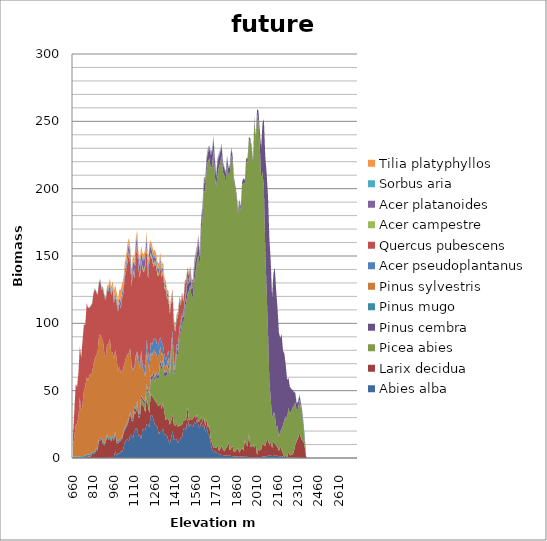
| Category | Abies alba | Larix decidua | Picea abies | Pinus cembra | Pinus mugo | Pinus sylvestris | Acer pseudoplantanus | Quercus pubescens | Acer campestre | Acer platanoides | Sorbus aria | Tilia platyphyllos |
|---|---|---|---|---|---|---|---|---|---|---|---|---|
| 660.0 | 0 | 0 | 0 | 0 | 0.553 | 7.628 | 0 | 8.391 | 0 | 0 | 0 | 0 |
| 670.0 | 0 | 0 | 0 | 0 | 1.092 | 14.611 | 0 | 19.9 | 0 | 0 | 0.004 | 0 |
| 680.0 | 0 | 0 | 0 | 0 | 1.154 | 23.184 | 0 | 30.595 | 0 | 0 | 0.009 | 0 |
| 690.0 | 0 | 0 | 0 | 0.001 | 0.747 | 24.879 | 0 | 27.264 | 0 | 0 | 0.007 | 0 |
| 700.0 | 0 | 0.001 | 0 | 0 | 1.039 | 29.308 | 0 | 33.375 | 0 | 0 | 0.004 | 0 |
| 710.0 | 0.001 | 0.005 | 0 | 0.007 | 1.251 | 43.691 | 0 | 37.955 | 0.001 | 0 | 0.033 | 0 |
| 720.0 | 0.001 | 0.025 | 0 | 0.006 | 1.204 | 32.964 | 0 | 40.258 | 0 | 0 | 0.059 | 0 |
| 730.0 | 0.006 | 0.107 | 0 | 0.009 | 1.093 | 38.507 | 0 | 47.532 | 0 | 0 | 0.059 | 0 |
| 740.0 | 0.01 | 0.091 | 0 | 0.01 | 1.386 | 48.705 | 0 | 48.924 | 0.001 | 0 | 0.09 | 0.001 |
| 750.0 | 0.004 | 0.028 | 0 | 0.018 | 1.806 | 50.579 | 0 | 46.245 | 0 | 0.001 | 0.112 | 0 |
| 760.0 | 0.004 | 1.65 | 0 | 0.017 | 1.257 | 57.588 | 0 | 54.304 | 0.002 | 0 | 0.22 | 0.002 |
| 770.0 | 0.011 | 1.138 | 0 | 0.018 | 1.195 | 54.765 | 0 | 54.594 | 0.002 | 0 | 0.171 | 0.002 |
| 780.0 | 0.014 | 1.143 | 0 | 0.019 | 1.459 | 58.888 | 0 | 49.966 | 0.003 | 0 | 0.278 | 0.004 |
| 790.0 | 0.011 | 1.18 | 0 | 0.018 | 1.632 | 59.679 | 0 | 50.544 | 0.005 | 0.005 | 0.263 | 0.004 |
| 800.0 | 0.013 | 2.947 | 0 | 0.021 | 1.125 | 59.226 | 0 | 51.121 | 0.006 | 0 | 0.42 | 0.002 |
| 810.0 | 0.022 | 2.844 | 0 | 0.026 | 1.407 | 65.503 | 0 | 52.335 | 0.002 | 0.001 | 0.564 | 0.008 |
| 820.0 | 0.032 | 3.51 | 0 | 0.035 | 1.442 | 68.87 | 0 | 51.803 | 0.003 | 0.003 | 0.585 | 0.007 |
| 830.0 | 0.024 | 6.032 | 0 | 0.03 | 1.182 | 68.666 | 0 | 47.328 | 0.007 | 0.002 | 0.803 | 0.005 |
| 840.0 | 0.019 | 5.224 | 0 | 0.042 | 1.485 | 71.338 | 0 | 42.749 | 0.006 | 0.005 | 0.831 | 0.016 |
| 850.0 | 0.03 | 12.788 | 0 | 0.043 | 1.38 | 75.548 | 0 | 39.815 | 0.011 | 0.008 | 0.937 | 0.017 |
| 860.0 | 0.026 | 13.085 | 0 | 0.034 | 1.23 | 77.623 | 0 | 39.498 | 0.011 | 0.006 | 1.156 | 0.671 |
| 870.0 | 0.04 | 14.062 | 0 | 0.068 | 1.401 | 73.53 | 0.001 | 35.79 | 0.032 | 0.039 | 1.417 | 0.192 |
| 880.0 | 0.052 | 10.199 | 0.001 | 0.064 | 1.592 | 74.618 | 0 | 39.084 | 0.04 | 0.025 | 1.571 | 0.092 |
| 890.0 | 0.059 | 9.232 | 0 | 0.073 | 1.314 | 66.758 | 0 | 42.352 | 0.047 | 0.111 | 1.133 | 0.716 |
| 900.0 | 0.068 | 11.732 | 0 | 0.089 | 1.677 | 61.973 | 0 | 41.632 | 0.126 | 0.133 | 1.371 | 1.326 |
| 910.0 | 0.105 | 15.899 | 0 | 0.128 | 1.607 | 66.639 | 0 | 39.588 | 0.145 | 0.212 | 1.724 | 1.79 |
| 920.0 | 0.129 | 13.371 | 0 | 0.16 | 1.372 | 69.675 | 0 | 39.178 | 0.188 | 0.208 | 1.838 | 2.367 |
| 930.0 | 0.149 | 14.137 | 0 | 0.226 | 1.854 | 72.182 | 0 | 40.438 | 0.223 | 0.506 | 1.784 | 1.621 |
| 940.0 | 0.173 | 12.23 | 0 | 0.155 | 1.452 | 64.828 | 0 | 41.96 | 0.326 | 0.3 | 1.789 | 3.808 |
| 950.0 | 0.247 | 14.659 | 0 | 0.222 | 1.371 | 62.032 | 0 | 47.195 | 0.353 | 0.512 | 1.857 | 2.939 |
| 960.0 | 0.949 | 11.809 | 0 | 0.276 | 1.996 | 58.618 | 0 | 41.581 | 0.57 | 1.238 | 2.034 | 5.227 |
| 970.0 | 5.049 | 13.441 | 0.001 | 0.341 | 1.353 | 60.098 | 0 | 40.128 | 0.568 | 1.201 | 1.694 | 4.653 |
| 980.0 | 1.83 | 9.222 | 0 | 0.374 | 1.427 | 61.093 | 0 | 40.936 | 0.612 | 1.921 | 1.348 | 4.274 |
| 990.0 | 3.627 | 7.135 | 0 | 0.487 | 1.364 | 51.356 | 0 | 44.537 | 0.633 | 2.521 | 1.147 | 3.994 |
| 1000.0 | 3.202 | 8.713 | 0 | 0.298 | 1.137 | 54.444 | 0 | 47.541 | 0.607 | 2.506 | 0.971 | 5.551 |
| 1010.0 | 4.93 | 7.964 | 0 | 0.503 | 1.085 | 49.142 | 0.003 | 47.28 | 0.729 | 3.9 | 1.229 | 8.308 |
| 1020.0 | 4.653 | 9.189 | 0 | 0.497 | 1.187 | 48.876 | 0.001 | 54.073 | 0.787 | 3.357 | 1.426 | 5.417 |
| 1030.0 | 7.308 | 10.787 | 0 | 0.405 | 1.097 | 47.78 | 0.002 | 55.537 | 0.771 | 3.345 | 1.163 | 5.265 |
| 1040.0 | 11.598 | 9.082 | 0.005 | 0.62 | 1.368 | 48.486 | 0.072 | 63.527 | 0.929 | 3.366 | 1.146 | 5.055 |
| 1050.0 | 13.318 | 9.394 | 0 | 0.772 | 1.304 | 50.295 | 0.001 | 63.797 | 1.026 | 3.713 | 1.26 | 5.221 |
| 1060.0 | 13.776 | 10.543 | 0.013 | 1.467 | 1.218 | 49.666 | 0.332 | 68.847 | 1.395 | 5.705 | 1.322 | 4.919 |
| 1070.0 | 12.647 | 15.578 | 0.072 | 0.987 | 0.811 | 47.836 | 0.146 | 74.336 | 1.175 | 5.755 | 1.056 | 3.082 |
| 1080.0 | 17.599 | 14.766 | 0.074 | 1.339 | 0.773 | 46.378 | 0.663 | 61.974 | 1.273 | 6.426 | 1.03 | 4.353 |
| 1090.0 | 16.613 | 11.102 | 0.167 | 1.266 | 0.753 | 37.624 | 1.043 | 59.346 | 1.34 | 5.717 | 0.719 | 3.378 |
| 1100.0 | 14.806 | 12.322 | 0.823 | 1.005 | 0.782 | 35.118 | 0.662 | 73.247 | 1.314 | 6.278 | 1.221 | 3.497 |
| 1110.0 | 19.271 | 14.372 | 1.137 | 2.76 | 0.709 | 28.852 | 0.826 | 65.72 | 1.289 | 8.153 | 0.952 | 3.436 |
| 1120.0 | 21.896 | 10.876 | 1.329 | 1.99 | 0.794 | 37.381 | 1.709 | 73.609 | 1.387 | 6.823 | 1.127 | 3.683 |
| 1130.0 | 21.854 | 17.008 | 1.12 | 1.538 | 0.673 | 36.321 | 0.822 | 79.693 | 1.102 | 5.013 | 1.056 | 2.985 |
| 1140.0 | 16.397 | 13.992 | 0.408 | 1.451 | 0.745 | 37.478 | 4.97 | 65.165 | 1.536 | 6.902 | 1.004 | 3.212 |
| 1150.0 | 16.94 | 12.711 | 1.197 | 1.977 | 0.7 | 32.496 | 1.198 | 66.644 | 1.582 | 6.792 | 1.447 | 3.753 |
| 1160.0 | 13.907 | 25.603 | 4.53 | 1.886 | 0.602 | 31.178 | 2.481 | 65.457 | 1.473 | 5.875 | 1.036 | 3.124 |
| 1170.0 | 21.735 | 17.494 | 3.024 | 1.801 | 0.549 | 22.276 | 2.606 | 70.364 | 1.739 | 5.87 | 1.124 | 3.419 |
| 1180.0 | 20.619 | 17.431 | 2.973 | 1.783 | 0.584 | 21.76 | 4.33 | 68.583 | 1.808 | 6.351 | 1.308 | 3.564 |
| 1190.0 | 20.876 | 12.624 | 6.344 | 1.825 | 0.496 | 17.583 | 7.456 | 74.625 | 1.907 | 7.504 | 1.093 | 3.322 |
| 1200.0 | 25.218 | 20.291 | 6.804 | 2.19 | 0.58 | 24.909 | 7.975 | 68.63 | 1.84 | 5.456 | 0.949 | 3.153 |
| 1210.0 | 25.19 | 13.01 | 9.523 | 2.302 | 0.583 | 21.438 | 7.609 | 53.189 | 1.974 | 6.294 | 1.083 | 3.228 |
| 1220.0 | 22.702 | 10.738 | 10.729 | 2.268 | 0.333 | 17.065 | 7.637 | 74.964 | 1.728 | 6.545 | 0.762 | 2.999 |
| 1230.0 | 31.724 | 16.202 | 10.319 | 2.591 | 0.638 | 17.035 | 7.477 | 64.654 | 2.009 | 4.422 | 1.06 | 3.729 |
| 1240.0 | 31.84 | 14.035 | 12.149 | 2.179 | 0.505 | 15.472 | 7.723 | 63.326 | 2.003 | 4.027 | 0.828 | 3.646 |
| 1250.0 | 28.738 | 15.667 | 16.53 | 3.198 | 0.686 | 15.406 | 8.089 | 53.441 | 2.193 | 4.52 | 1.255 | 3.847 |
| 1260.0 | 24.873 | 17.857 | 13.728 | 2.632 | 0.719 | 19.644 | 9.502 | 55.711 | 2.045 | 3.033 | 1.061 | 3.685 |
| 1270.0 | 23.862 | 17.656 | 19.249 | 2.046 | 0.947 | 13.896 | 10.081 | 54.321 | 2.115 | 3.051 | 1.038 | 3.545 |
| 1280.0 | 22.577 | 16.946 | 19.004 | 2.453 | 0.954 | 12.013 | 7.738 | 53.86 | 2.287 | 2.927 | 0.957 | 3.639 |
| 1290.0 | 17.498 | 20.831 | 21.432 | 2.335 | 0.789 | 14.243 | 9.402 | 48.624 | 2.117 | 3.049 | 1.105 | 3.154 |
| 1300.0 | 19.954 | 21.135 | 27.819 | 2.853 | 0.662 | 10.236 | 7.029 | 53.764 | 2.104 | 3.076 | 0.926 | 3.063 |
| 1310.0 | 19.989 | 16.416 | 29.024 | 2.612 | 0.704 | 7.755 | 9.522 | 48.11 | 2.284 | 2.981 | 0.811 | 3.497 |
| 1320.0 | 21.602 | 19.55 | 28.644 | 2.391 | 0.518 | 4.936 | 6.114 | 54.169 | 1.818 | 2.182 | 0.696 | 2.836 |
| 1330.0 | 17.563 | 16.509 | 26.533 | 2.954 | 0.554 | 4.957 | 7.515 | 49.443 | 2.07 | 2.11 | 0.804 | 3.069 |
| 1340.0 | 17.141 | 10.835 | 32.652 | 2.636 | 0.511 | 3.98 | 4.925 | 52.068 | 1.791 | 1.969 | 0.76 | 2.364 |
| 1350.0 | 16.376 | 13.145 | 32.584 | 2.742 | 0.664 | 4.028 | 6.555 | 42.047 | 1.909 | 1.958 | 0.649 | 2.335 |
| 1360.0 | 13 | 16.073 | 38.718 | 3.312 | 0.622 | 3.119 | 5.377 | 37.631 | 1.724 | 1.672 | 0.731 | 2.378 |
| 1370.0 | 10.615 | 14.01 | 34.262 | 3.072 | 0.572 | 2.381 | 3.098 | 38.861 | 1.561 | 1.596 | 0.584 | 2.048 |
| 1380.0 | 15.004 | 12.876 | 46.393 | 2.948 | 0.533 | 3.185 | 2.658 | 31.206 | 1.448 | 1.425 | 0.551 | 1.855 |
| 1390.0 | 20.254 | 11.97 | 53.503 | 3.554 | 0.422 | 1.739 | 3.749 | 26.237 | 1.312 | 1.27 | 0.512 | 1.435 |
| 1400.0 | 13.55 | 11.197 | 36.646 | 2.593 | 0.434 | 2.031 | 2.172 | 30.065 | 1.196 | 1.149 | 0.486 | 1.178 |
| 1410.0 | 14.348 | 9.65 | 41.34 | 2.599 | 0.378 | 1.629 | 3.014 | 20.611 | 1.452 | 1.53 | 0.556 | 1.333 |
| 1420.0 | 13.686 | 11.703 | 51.655 | 3.727 | 0.352 | 0.603 | 2.735 | 18.247 | 1.375 | 1.307 | 0.424 | 1.062 |
| 1430.0 | 11.066 | 12.059 | 53.982 | 2.492 | 0.213 | 0.836 | 3.503 | 21.215 | 1.254 | 1.248 | 0.293 | 0.824 |
| 1440.0 | 13.153 | 11.006 | 64.396 | 4.007 | 0.196 | 0.694 | 2.078 | 21.444 | 1.213 | 1.081 | 0.328 | 0.704 |
| 1450.0 | 15.047 | 9.064 | 69.809 | 4.379 | 0.192 | 0.496 | 2.702 | 11.45 | 1.331 | 1.162 | 0.323 | 0.656 |
| 1460.0 | 15.568 | 9.305 | 76.199 | 2.807 | 0.128 | 1.294 | 2.106 | 13.584 | 0.848 | 0.773 | 0.192 | 0.38 |
| 1470.0 | 21.647 | 6.077 | 72.394 | 4.852 | 0.15 | 0.828 | 1.965 | 7.726 | 0.925 | 0.922 | 0.216 | 0.361 |
| 1480.0 | 22.295 | 5.674 | 82.308 | 3.714 | 0.124 | 0.684 | 2.393 | 11.781 | 1.173 | 1.041 | 0.187 | 0.424 |
| 1490.0 | 21.083 | 7.688 | 86.819 | 6.203 | 0.126 | 0.835 | 1.891 | 6.272 | 1.001 | 0.964 | 0.22 | 0.372 |
| 1500.0 | 30.041 | 7.722 | 83.861 | 8.96 | 0.111 | 0.744 | 2.389 | 5.546 | 1.026 | 0.997 | 0.161 | 0.304 |
| 1510.0 | 23.042 | 4.619 | 96.546 | 5.169 | 0.23 | 0.487 | 2.372 | 2.847 | 0.996 | 0.911 | 0.245 | 0.29 |
| 1520.0 | 25.4 | 3.701 | 99.462 | 5.7 | 0.218 | 1.236 | 1.586 | 3.064 | 0.848 | 0.817 | 0.272 | 0.224 |
| 1530.0 | 23.658 | 4.713 | 90.767 | 6.413 | 0.174 | 0.939 | 2.102 | 1.778 | 1.045 | 0.918 | 0.28 | 0.217 |
| 1540.0 | 23.165 | 5.99 | 91.048 | 6.213 | 0.192 | 0.743 | 1.717 | 1.489 | 0.878 | 0.757 | 0.312 | 0.159 |
| 1550.0 | 26.701 | 4.922 | 100.079 | 9.199 | 0.173 | 0.875 | 1.68 | 2.085 | 0.758 | 0.707 | 0.173 | 0.078 |
| 1560.0 | 25.166 | 4.25 | 109.467 | 8.47 | 0.169 | 0.29 | 1.527 | 1.583 | 0.784 | 0.674 | 0.181 | 0.065 |
| 1570.0 | 29.307 | 3.289 | 113.643 | 6.256 | 0.118 | 0.149 | 1.733 | 1.757 | 0.737 | 0.665 | 0.16 | 0.013 |
| 1580.0 | 23.552 | 3.541 | 124.104 | 9.161 | 0.227 | 0.682 | 1.625 | 1.22 | 0.743 | 0.692 | 0.212 | 0.008 |
| 1590.0 | 22.191 | 5.18 | 114.6 | 6.727 | 0.159 | 0.361 | 1.32 | 1.233 | 0.694 | 0.633 | 0.19 | 0.01 |
| 1600.0 | 27.209 | 3.975 | 137.729 | 6.471 | 0.106 | 0.305 | 1.377 | 1.298 | 0.57 | 0.575 | 0.152 | 0.003 |
| 1610.0 | 23.107 | 3.703 | 150.533 | 6.732 | 0.117 | 0.363 | 1.726 | 0.888 | 0.607 | 0.544 | 0.144 | 0 |
| 1620.0 | 25.145 | 5.362 | 167.245 | 5.972 | 0.106 | 1.201 | 1.442 | 0.842 | 0.635 | 0.554 | 0.167 | 0 |
| 1630.0 | 19.323 | 4.344 | 174.543 | 6.911 | 0.009 | 0.061 | 1.521 | 0.673 | 0.465 | 0.386 | 0.089 | 0 |
| 1640.0 | 23.483 | 5.138 | 185.585 | 7.171 | 0.077 | 0.178 | 1.388 | 0.47 | 0.532 | 0.444 | 0.096 | 0 |
| 1650.0 | 18.246 | 4.234 | 197.789 | 6.71 | 0.074 | 0.111 | 1.536 | 0.812 | 0.553 | 0.482 | 0.097 | 0 |
| 1660.0 | 16.437 | 7.685 | 198.539 | 7.073 | 0.086 | 0.066 | 1.111 | 0.356 | 0.344 | 0.305 | 0.079 | 0 |
| 1670.0 | 10.895 | 3.136 | 200.731 | 10.497 | 0.042 | 0.158 | 1.267 | 0.478 | 0.315 | 0.326 | 0.106 | 0 |
| 1680.0 | 6.652 | 4.353 | 205.712 | 9.809 | 0.129 | 0.109 | 1.18 | 0.29 | 0.324 | 0.329 | 0.075 | 0 |
| 1690.0 | 4.119 | 3.447 | 221.416 | 7.728 | 0.036 | 0.131 | 1.198 | 0.491 | 0.315 | 0.296 | 0.058 | 0 |
| 1700.0 | 5.445 | 2.757 | 201.667 | 11.301 | 0.076 | 0.126 | 1.14 | 0.495 | 0.348 | 0.316 | 0.114 | 0 |
| 1710.0 | 3.88 | 3.672 | 193.837 | 7.02 | 0.037 | 0.291 | 1.245 | 0.392 | 0.336 | 0.319 | 0.094 | 0 |
| 1720.0 | 3.752 | 5.609 | 201.19 | 9.701 | 0.11 | 0.167 | 1.312 | 0.411 | 0.348 | 0.293 | 0.107 | 0 |
| 1730.0 | 3.008 | 2.289 | 210.741 | 7.744 | 0.13 | 0.184 | 1.038 | 0.319 | 0.301 | 0.31 | 0.101 | 0 |
| 1740.0 | 2.498 | 4.315 | 212.607 | 7.571 | 0.076 | 0.14 | 1.154 | 0.403 | 0.263 | 0.25 | 0.099 | 0 |
| 1750.0 | 2.245 | 7.032 | 215.198 | 7.053 | 0.065 | 0.169 | 0.964 | 0.3 | 0.205 | 0.186 | 0.076 | 0 |
| 1760.0 | 2.253 | 4.204 | 205.652 | 5.857 | 0.068 | 0.068 | 0.985 | 0.26 | 0.195 | 0.202 | 0.046 | 0 |
| 1770.0 | 1.728 | 3.186 | 204.852 | 5.202 | 0.099 | 0.065 | 0.696 | 0.18 | 0.169 | 0.127 | 0.059 | 0 |
| 1780.0 | 1.828 | 5.134 | 197.75 | 6.317 | 0.086 | 0.134 | 0.917 | 0.188 | 0.191 | 0.165 | 0.048 | 0 |
| 1790.0 | 1.7 | 6.561 | 209.491 | 5.555 | 0.143 | 0.091 | 0.866 | 0.196 | 0.139 | 0.126 | 0.049 | 0 |
| 1800.0 | 1.607 | 10.064 | 198.489 | 4.73 | 0.048 | 0.101 | 0.723 | 0.209 | 0.12 | 0.086 | 0.07 | 0 |
| 1810.0 | 1.636 | 4.06 | 205.915 | 4.695 | 0.076 | 0.117 | 0.819 | 0.166 | 0.134 | 0.108 | 0.068 | 0 |
| 1820.0 | 1.521 | 5.625 | 217.805 | 4.49 | 0.057 | 0.096 | 0.784 | 0.181 | 0.086 | 0.096 | 0.071 | 0 |
| 1830.0 | 1.373 | 7.637 | 211.76 | 3.695 | 0.037 | 0.083 | 0.831 | 0.117 | 0.032 | 0.071 | 0.046 | 0 |
| 1840.0 | 1.16 | 3.374 | 200.468 | 2.769 | 0.014 | 0.027 | 0.695 | 0.133 | 0.013 | 0.056 | 0.036 | 0 |
| 1850.0 | 0.915 | 3.995 | 194.68 | 2.329 | 0.033 | 0.032 | 0.558 | 0.04 | 0.009 | 0.02 | 0.012 | 0 |
| 1860.0 | 1.19 | 5.109 | 187.507 | 1.748 | 0.069 | 0.101 | 0.534 | 0.078 | 0.009 | 0.012 | 0.04 | 0 |
| 1870.0 | 0.946 | 6.195 | 174.1 | 3.165 | 0.096 | 0.082 | 0.448 | 0.085 | 0.005 | 0.007 | 0.033 | 0 |
| 1880.0 | 1.015 | 2.907 | 186.061 | 1.501 | 0.04 | 0.007 | 0.411 | 0.081 | 0 | 0.002 | 0.03 | 0 |
| 1890.0 | 1.102 | 5.252 | 177.377 | 2.487 | 0.014 | 0.008 | 0.298 | 0.024 | 0 | 0.001 | 0.005 | 0 |
| 1900.0 | 1.051 | 6.569 | 195.402 | 1.686 | 0.026 | 0.018 | 0.326 | 0.095 | 0 | 0 | 0.019 | 0 |
| 1910.0 | 0.927 | 4.503 | 198.936 | 3.128 | 0.055 | 0.027 | 0.264 | 0.088 | 0 | 0 | 0.008 | 0 |
| 1920.0 | 0.81 | 12.54 | 190.458 | 2.382 | 0.088 | 0.025 | 0.236 | 0.025 | 0 | 0 | 0.014 | 0 |
| 1930.0 | 0.972 | 9.27 | 209.662 | 2.559 | 0.041 | 0.029 | 0.184 | 0.075 | 0 | 0 | 0.012 | 0 |
| 1940.0 | 0.816 | 7.535 | 210.891 | 3.328 | 0.074 | 0.016 | 0.174 | 0.023 | 0 | 0 | 0.004 | 0 |
| 1950.0 | 0.756 | 17.193 | 218.696 | 1.412 | 0.052 | 0.021 | 0.122 | 0.028 | 0 | 0 | 0.004 | 0 |
| 1960.0 | 0.594 | 8.145 | 227.169 | 1.566 | 0.001 | 0.001 | 0.081 | 0.009 | 0 | 0 | 0 | 0 |
| 1970.0 | 0.586 | 7.352 | 221.894 | 1.853 | 0 | 0 | 0.085 | 0.002 | 0 | 0 | 0 | 0 |
| 1980.0 | 0.62 | 9.307 | 209.494 | 1.935 | 0.022 | 0.019 | 0.104 | 0.004 | 0 | 0 | 0.002 | 0 |
| 1990.0 | 0.474 | 7.051 | 242.803 | 2.136 | 0.002 | 0 | 0.049 | 0.013 | 0 | 0 | 0 | 0 |
| 2000.0 | 0.571 | 9.347 | 224.926 | 3.486 | 0.061 | 0.038 | 0.032 | 0.016 | 0 | 0 | 0.003 | 0 |
| 2010.0 | 0.579 | 1.64 | 253.174 | 3.681 | 0 | 0 | 0.014 | 0.005 | 0 | 0 | 0.001 | 0 |
| 2020.0 | 0.58 | 6.142 | 243.551 | 7.624 | 0.01 | 0.022 | 0.014 | 0.003 | 0 | 0 | 0 | 0 |
| 2030.0 | 0.573 | 4.956 | 225.647 | 11.047 | 0 | 0 | 0 | 0.013 | 0 | 0 | 0 | 0 |
| 2040.0 | 0.732 | 5.866 | 201.117 | 22.963 | 0 | 0 | 0 | 0.004 | 0 | 0 | 0 | 0 |
| 2050.0 | 0.975 | 9.803 | 201.878 | 36.201 | 0 | 0.01 | 0 | 0.002 | 0 | 0 | 0 | 0 |
| 2060.0 | 1.144 | 8.533 | 190.276 | 51.401 | 0.004 | 0 | 0 | 0 | 0 | 0 | 0 | 0 |
| 2070.0 | 1.143 | 7.876 | 146.467 | 68.776 | 0 | 0 | 0 | 0.004 | 0 | 0 | 0 | 0 |
| 2080.0 | 1.269 | 11.853 | 110.503 | 87.897 | 0 | 0 | 0 | 0 | 0 | 0 | 0 | 0 |
| 2090.0 | 1.81 | 11.725 | 80.728 | 100.22 | 0.039 | 0.002 | 0 | 0.002 | 0 | 0 | 0 | 0 |
| 2100.0 | 1.645 | 7.743 | 47.9 | 106.211 | 0.037 | 0.004 | 0 | 0.003 | 0 | 0 | 0 | 0 |
| 2110.0 | 1.738 | 10.256 | 31.925 | 102.049 | 0.206 | 0.104 | 0 | 0.003 | 0 | 0 | 0 | 0 |
| 2120.0 | 1.463 | 5.903 | 22.078 | 89.792 | 0.187 | 0.098 | 0 | 0 | 0 | 0 | 0 | 0 |
| 2130.0 | 1.655 | 10.889 | 21.532 | 103.035 | 0.086 | 0.065 | 0 | 0 | 0 | 0 | 0 | 0 |
| 2140.0 | 1.747 | 8.909 | 21.907 | 108.791 | 0.127 | 0.033 | 0 | 0 | 0 | 0 | 0 | 0 |
| 2150.0 | 1.672 | 7.62 | 13.474 | 101.426 | 0.112 | 0.032 | 0 | 0 | 0 | 0 | 0 | 0 |
| 2160.0 | 1.604 | 6.386 | 16.245 | 86.724 | 0.027 | 0 | 0 | 0 | 0 | 0 | 0 | 0 |
| 2170.0 | 1.339 | 3.748 | 10.424 | 77.629 | 0 | 0 | 0 | 0 | 0 | 0 | 0 | 0 |
| 2180.0 | 1.205 | 7.665 | 10.833 | 69.404 | 0.115 | 0 | 0 | 0 | 0 | 0 | 0 | 0 |
| 2190.0 | 1.296 | 4.68 | 16.064 | 69.921 | 0.034 | 0 | 0 | 0 | 0 | 0 | 0 | 0 |
| 2200.0 | 1.058 | 2.178 | 21.03 | 55.371 | 0.071 | 0 | 0 | 0 | 0 | 0 | 0 | 0 |
| 2210.0 | 0.672 | 0 | 27.574 | 49.235 | 0 | 0 | 0 | 0 | 0 | 0 | 0 | 0 |
| 2220.0 | 0.741 | 1.22 | 29.053 | 38.401 | 0 | 0 | 0 | 0 | 0 | 0 | 0 | 0 |
| 2230.0 | 0.565 | 0 | 28.438 | 28.995 | 0 | 0 | 0 | 0 | 0 | 0 | 0 | 0 |
| 2240.0 | 0.578 | 3.855 | 32.943 | 22.2 | 0 | 0 | 0 | 0 | 0 | 0 | 0 | 0 |
| 2250.0 | 0.484 | 1.466 | 30.798 | 20.227 | 0 | 0 | 0 | 0 | 0 | 0 | 0 | 0 |
| 2260.0 | 0.391 | 1.946 | 32.694 | 16.422 | 0 | 0 | 0 | 0 | 0 | 0 | 0 | 0 |
| 2270.0 | 0.299 | 2.001 | 34.828 | 13.43 | 0.025 | 0 | 0 | 0 | 0 | 0 | 0 | 0 |
| 2280.0 | 0.251 | 4.733 | 34.073 | 9.795 | 0.406 | 0 | 0 | 0 | 0 | 0 | 0 | 0 |
| 2290.0 | 0.157 | 9.492 | 31.554 | 6.737 | 0.889 | 0 | 0 | 0 | 0 | 0 | 0 | 0 |
| 2300.0 | 0.152 | 12.475 | 22.968 | 4.997 | 0.521 | 0 | 0 | 0 | 0 | 0 | 0 | 0 |
| 2310.0 | 0.13 | 14.367 | 21.624 | 5.004 | 0.579 | 0 | 0 | 0 | 0 | 0 | 0 | 0 |
| 2320.0 | 0.205 | 18.662 | 24.225 | 3.382 | 0.93 | 0 | 0 | 0 | 0 | 0 | 0 | 0 |
| 2330.0 | 0.047 | 15.67 | 22.553 | 3.024 | 0.555 | 0 | 0 | 0 | 0 | 0 | 0 | 0 |
| 2340.0 | 0.002 | 13.027 | 18.392 | 3.189 | 1.04 | 0 | 0 | 0 | 0 | 0 | 0 | 0 |
| 2350.0 | 0 | 12.552 | 9.076 | 3.056 | 2.172 | 0 | 0 | 0 | 0 | 0 | 0 | 0 |
| 2360.0 | 0 | 8.019 | 2.988 | 2.39 | 2.048 | 0 | 0 | 0 | 0 | 0 | 0 | 0 |
| 2370.0 | 0 | 0.424 | 0.139 | 0.171 | 0.152 | 0 | 0 | 0 | 0 | 0 | 0 | 0 |
| 2380.0 | 0 | 0 | 0 | 0 | 0 | 0 | 0 | 0 | 0 | 0 | 0 | 0 |
| 2390.0 | 0 | 0 | 0 | 0 | 0 | 0 | 0 | 0 | 0 | 0 | 0 | 0 |
| 2400.0 | 0 | 0 | 0 | 0 | 0 | 0 | 0 | 0 | 0 | 0 | 0 | 0 |
| 2410.0 | 0 | 0 | 0 | 0 | 0 | 0 | 0 | 0 | 0 | 0 | 0 | 0 |
| 2420.0 | 0 | 0 | 0 | 0 | 0 | 0 | 0 | 0 | 0 | 0 | 0 | 0 |
| 2430.0 | 0 | 0 | 0 | 0 | 0 | 0 | 0 | 0 | 0 | 0 | 0 | 0 |
| 2440.0 | 0 | 0 | 0 | 0 | 0 | 0 | 0 | 0 | 0 | 0 | 0 | 0 |
| 2450.0 | 0 | 0 | 0 | 0 | 0 | 0 | 0 | 0 | 0 | 0 | 0 | 0 |
| 2460.0 | 0 | 0 | 0 | 0 | 0 | 0 | 0 | 0 | 0 | 0 | 0 | 0 |
| 2470.0 | 0 | 0 | 0 | 0 | 0 | 0 | 0 | 0 | 0 | 0 | 0 | 0 |
| 2480.0 | 0 | 0 | 0 | 0 | 0 | 0 | 0 | 0 | 0 | 0 | 0 | 0 |
| 2490.0 | 0 | 0 | 0 | 0 | 0 | 0 | 0 | 0 | 0 | 0 | 0 | 0 |
| 2500.0 | 0 | 0 | 0 | 0 | 0 | 0 | 0 | 0 | 0 | 0 | 0 | 0 |
| 2510.0 | 0 | 0 | 0 | 0 | 0 | 0 | 0 | 0 | 0 | 0 | 0 | 0 |
| 2520.0 | 0 | 0 | 0 | 0 | 0 | 0 | 0 | 0 | 0 | 0 | 0 | 0 |
| 2530.0 | 0 | 0 | 0 | 0 | 0 | 0 | 0 | 0 | 0 | 0 | 0 | 0 |
| 2540.0 | 0 | 0 | 0 | 0 | 0 | 0 | 0 | 0 | 0 | 0 | 0 | 0 |
| 2550.0 | 0 | 0 | 0 | 0 | 0 | 0 | 0 | 0 | 0 | 0 | 0 | 0 |
| 2560.0 | 0 | 0 | 0 | 0 | 0 | 0 | 0 | 0 | 0 | 0 | 0 | 0 |
| 2570.0 | 0 | 0 | 0 | 0 | 0 | 0 | 0 | 0 | 0 | 0 | 0 | 0 |
| 2580.0 | 0 | 0 | 0 | 0 | 0 | 0 | 0 | 0 | 0 | 0 | 0 | 0 |
| 2590.0 | 0 | 0 | 0 | 0 | 0 | 0 | 0 | 0 | 0 | 0 | 0 | 0 |
| 2600.0 | 0 | 0 | 0 | 0 | 0 | 0 | 0 | 0 | 0 | 0 | 0 | 0 |
| 2610.0 | 0 | 0 | 0 | 0 | 0 | 0 | 0 | 0 | 0 | 0 | 0 | 0 |
| 2620.0 | 0 | 0 | 0 | 0 | 0 | 0 | 0 | 0 | 0 | 0 | 0 | 0 |
| 2630.0 | 0 | 0 | 0 | 0 | 0 | 0 | 0 | 0 | 0 | 0 | 0 | 0 |
| 2640.0 | 0 | 0 | 0 | 0 | 0 | 0 | 0 | 0 | 0 | 0 | 0 | 0 |
| 2650.0 | 0 | 0 | 0 | 0 | 0 | 0 | 0 | 0 | 0 | 0 | 0 | 0 |
| 2660.0 | 0 | 0 | 0 | 0 | 0 | 0 | 0 | 0 | 0 | 0 | 0 | 0 |
| 2670.0 | 0 | 0 | 0 | 0 | 0 | 0 | 0 | 0 | 0 | 0 | 0 | 0 |
| 2680.0 | 0 | 0 | 0 | 0 | 0 | 0 | 0 | 0 | 0 | 0 | 0 | 0 |
| 2690.0 | 0 | 0 | 0 | 0 | 0 | 0 | 0 | 0 | 0 | 0 | 0 | 0 |
| 2700.0 | 0 | 0 | 0 | 0 | 0 | 0 | 0 | 0 | 0 | 0 | 0 | 0 |
| 2710.0 | 0 | 0 | 0 | 0 | 0 | 0 | 0 | 0 | 0 | 0 | 0 | 0 |
| 2720.0 | 0 | 0 | 0 | 0 | 0 | 0 | 0 | 0 | 0 | 0 | 0 | 0 |
| 2730.0 | 0 | 0 | 0 | 0 | 0 | 0 | 0 | 0 | 0 | 0 | 0 | 0 |
| 2740.0 | 0 | 0 | 0 | 0 | 0 | 0 | 0 | 0 | 0 | 0 | 0 | 0 |
| 2750.0 | 0 | 0 | 0 | 0 | 0 | 0 | 0 | 0 | 0 | 0 | 0 | 0 |